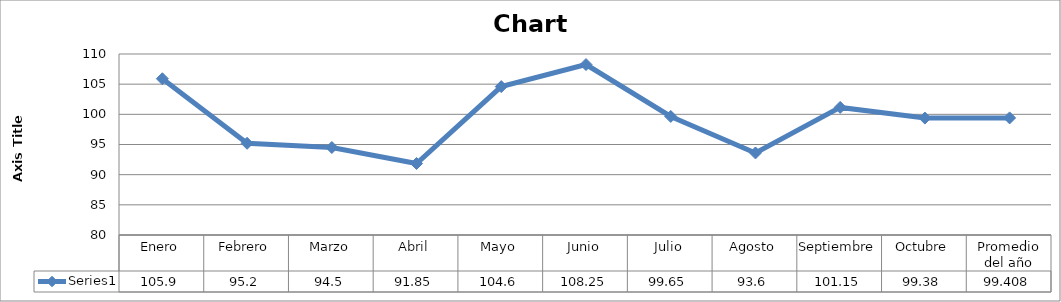
| Category | Series 0 |
|---|---|
| Enero | 105.9 |
| Febrero | 95.2 |
| Marzo | 94.5 |
| Abril | 91.85 |
| Mayo | 104.6 |
| Junio | 108.25 |
| Julio | 99.65 |
| Agosto | 93.6 |
| Septiembre | 101.15 |
| Octubre | 99.38 |
| Promedio del año | 99.408 |